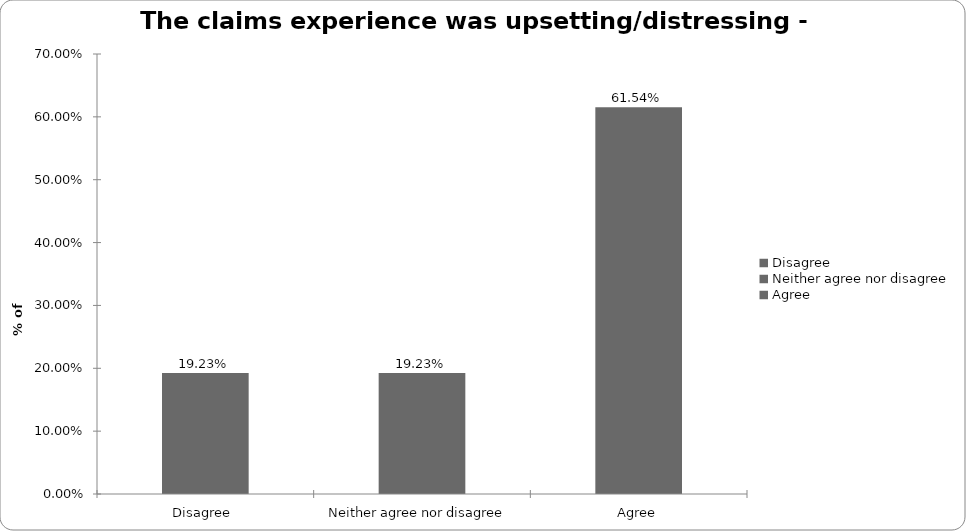
| Category | Motor |
|---|---|
| Disagree  | 0.192 |
| Neither agree nor disagree  | 0.192 |
| Agree | 0.615 |